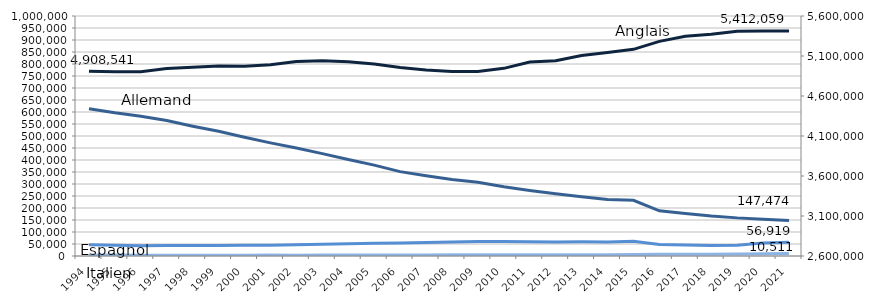
| Category | Allemand | Espagnol | Italien |
|---|---|---|---|
| 1994 | 613625 | 46685 | 3459 |
| 1995 | 596545 | 44951 | 3732 |
| 1996 | 582126 | 43221 | 3138 |
| 1997 | 564342 | 43677 | 2851 |
| 1998 | 540924 | 44141 | 3169 |
| 1999 | 519775 | 44259 | 3033 |
| 2000 | 494496 | 44298 | 3332 |
| 2001 | 471470 | 45203 | 3666 |
| 2002 | 449810 | 46424 | 3627 |
| 2003 | 426537 | 49455 | 3817 |
| 2004 | 402388 | 51007 | 3859 |
| 2005 | 378585 | 52964 | 3921 |
| 2006 | 351519 | 54622 | 4060 |
| 2007 | 334430 | 56512 | 4532 |
| 2008 | 318917 | 57834 | 5033 |
| 2009 | 306983 | 60135 | 5157 |
| 2010 | 288593 | 59973 | 5032 |
| 2011 | 273333 | 59440 | 5133 |
| 2012 | 259055 | 58707 | 5410 |
| 2013 | 247047 | 59428 | 4796 |
| 2014 | 235583 | 58211 | 5046 |
| 2015 | 231919 | 61293 | 5839 |
| 2016 | 188441 | 48411 | 6946 |
| 2017 | 177198 | 45348 | 7272 |
| 2018 | 166804 | 43692 | 7007 |
| 2019 | 158849 | 44349 | 8218 |
| 2020 | 153352 | 54068 | 9833 |
| 2021 | 147474 | 56919 | 10511 |